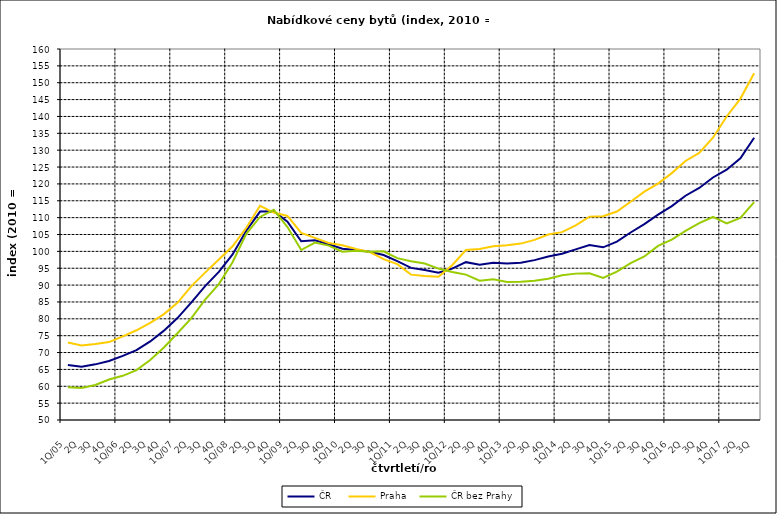
| Category | ČR  | Praha | ČR bez Prahy  |
|---|---|---|---|
| 1Q/05 | 66.3 | 73 | 59.7 |
| 2Q | 65.8 | 72.1 | 59.5 |
| 3Q | 66.5 | 72.5 | 60.4 |
| 4Q | 67.5 | 73.1 | 62 |
| 1Q/06 | 69 | 74.8 | 63.1 |
| 2Q | 70.7 | 76.6 | 64.8 |
| 3Q | 73.3 | 78.8 | 67.8 |
| 4Q | 76.5 | 81.4 | 71.5 |
| 1Q/07 | 80.3 | 84.8 | 75.8 |
| 2Q | 84.9 | 89.7 | 80.2 |
| 3Q | 89.7 | 93.7 | 85.7 |
| 4Q | 93.9 | 97.6 | 90.3 |
| 1Q/08 | 99.1 | 101.5 | 96.8 |
| 2Q | 106.1 | 107 | 105.2 |
| 3Q | 111.8 | 113.5 | 110.2 |
| 4Q | 111.9 | 111.5 | 112.3 |
| 1Q/09 | 108.8 | 110.5 | 107.2 |
| 2Q | 103 | 105.5 | 100.4 |
| 3Q | 103.3 | 104 | 102.6 |
| 4Q | 102.1 | 102.5 | 101.7 |
| 1Q/10 | 100.8 | 101.8 | 99.9 |
| 2Q | 100.4 | 100.7 | 100.2 |
| 3Q | 99.9 | 99.8 | 99.9 |
| 4Q | 98.9 | 97.7 | 100 |
| 1Q/11 | 97.1 | 96.2 | 98 |
| 2Q | 95.1 | 93.1 | 97.1 |
| 3Q | 94.5 | 92.7 | 96.4 |
| 4Q | 93.7 | 92.5 | 94.9 |
| 1Q/12 | 94.9 | 95.9 | 93.9 |
| 2Q | 96.8 | 100.4 | 93.1 |
| 3Q | 96 | 100.7 | 91.3 |
| 4Q | 96.6 | 101.5 | 91.7 |
| 1Q/13 | 96.4 | 101.8 | 90.9 |
| 2Q | 96.6 | 102.3 | 91 |
| 3Q | 97.4 | 103.4 | 91.3 |
| 4Q | 98.5 | 105 | 91.9 |
| 1Q/14 | 99.3 | 105.7 | 92.9 |
| 2Q | 100.6 | 107.7 | 93.4 |
| 3Q | 101.9 | 110.3 | 93.5 |
| 4Q | 101.2 | 110.4 | 92.1 |
| 1Q/15 | 102.9 | 111.8 | 94 |
| 2Q | 105.6 | 114.7 | 96.5 |
| 3Q | 108.1 | 117.7 | 98.5 |
| 4Q | 110.9 | 120.1 | 101.6 |
| 1Q/16 | 113.4 | 123.2 | 103.5 |
| 2Q | 116.5 | 126.8 | 106.1 |
| 3Q | 118.8 | 129.2 | 108.4 |
| 4Q | 121.9 | 133.7 | 110.2 |
| 1Q/17 | 124.2 | 140 | 108.3 |
| 2Q | 127.6 | 145.3 | 109.9 |
| 3Q | 133.7 | 152.8 | 114.6 |